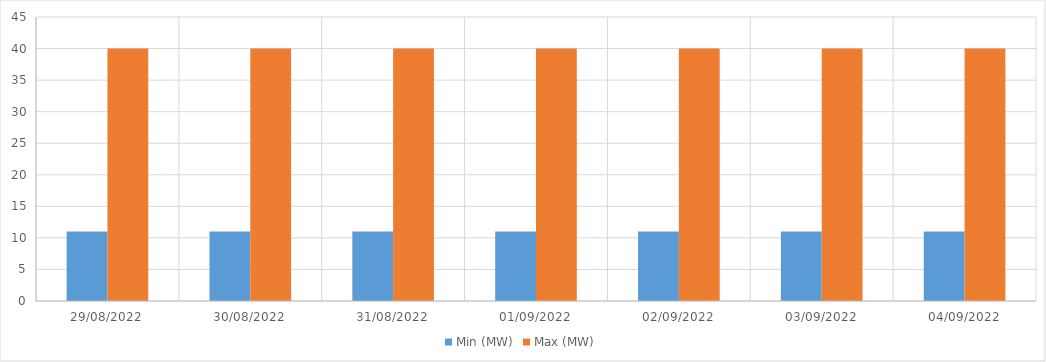
| Category | Min (MW) | Max (MW) |
|---|---|---|
| 29/08/2022 | 11 | 40 |
| 30/08/2022 | 11 | 40 |
| 31/08/2022 | 11 | 40 |
| 01/09/2022 | 11 | 40 |
| 02/09/2022 | 11 | 40 |
| 03/09/2022 | 11 | 40 |
| 04/09/2022 | 11 | 40 |